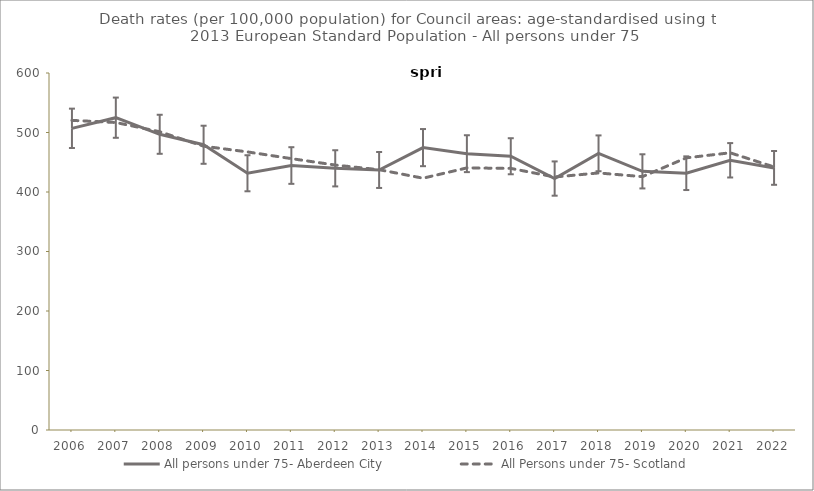
| Category | All persons under 75- Aberdeen City | All Persons under 75- Scotland |
|---|---|---|
| 2006.0 | 507 | 520.4 |
| 2007.0 | 524.9 | 516.8 |
| 2008.0 | 497 | 501.3 |
| 2009.0 | 479.4 | 477 |
| 2010.0 | 431.5 | 467.4 |
| 2011.0 | 444.5 | 456.1 |
| 2012.0 | 439.8 | 445.3 |
| 2013.0 | 437 | 437.5 |
| 2014.0 | 474.6 | 423.2 |
| 2015.0 | 464.4 | 440.5 |
| 2016.0 | 460.1 | 439.7 |
| 2017.0 | 422.6 | 425.2 |
| 2018.0 | 465 | 432 |
| 2019.0 | 434.7 | 425.8 |
| 2020.0 | 431.6 | 457.4 |
| 2021.0 | 453.3 | 465.9 |
| 2022.0 | 440.5 | 442.1 |